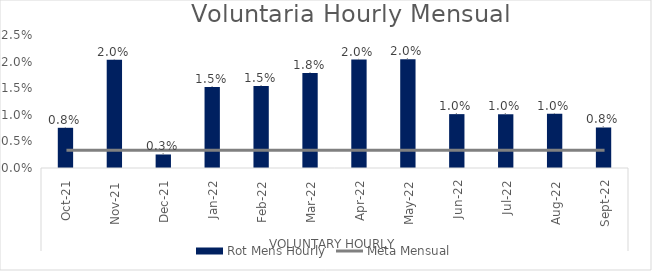
| Category | Series 4 | Rot Mens Hourly | Series 5 |
|---|---|---|---|
| 0 |  | 0.008 |  |
| 1 |  | 0.02 |  |
| 2 |  | 0.003 |  |
| 3 |  | 0.015 |  |
| 4 |  | 0.015 |  |
| 5 |  | 0.018 |  |
| 6 |  | 0.02 |  |
| 7 |  | 0.02 |  |
| 8 |  | 0.01 |  |
| 9 |  | 0.01 |  |
| 10 |  | 0.01 |  |
| 11 |  | 0.008 |  |